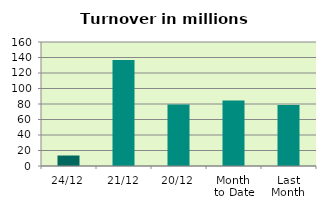
| Category | Series 0 |
|---|---|
| 24/12 | 13.532 |
| 21/12 | 136.796 |
| 20/12 | 79.354 |
| Month 
to Date | 84.358 |
| Last
Month | 78.658 |